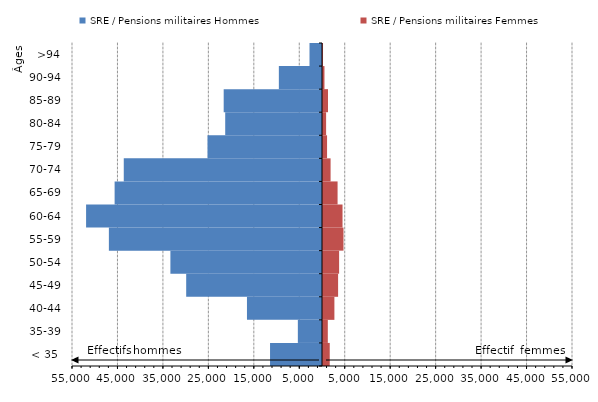
| Category | SRE / Pensions militaires Hommes | SRE / Pensions militaires Femmes |
|---|---|---|
| < 35  | -11431 | 1702 |
| 35-39 | -5315 | 1279 |
| 40-44 | -16507 | 2728 |
| 45-49 | -29878 | 3542 |
| 50-54 | -33352 | 3764 |
| 55-59 | -46887 | 4728 |
| 60-64 | -51901 | 4516 |
| 65-69 | -45624 | 3427 |
| 70-74 | -43611 | 1890 |
| 75-79 | -25190 | 1113 |
| 80-84 | -21294 | 904 |
| 85-89 | -21628 | 1315 |
| 90-94 | -9492 | 542 |
| >94 | -2750 | 224 |